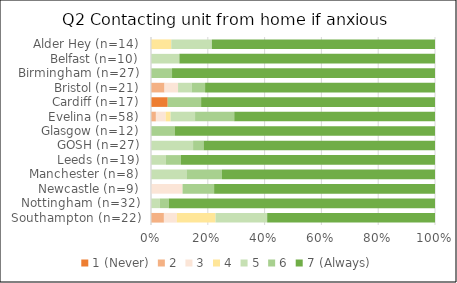
| Category | 1 (Never) | 2 | 3 | 4 | 5 | 6 | 7 (Always) |
|---|---|---|---|---|---|---|---|
| Southampton (n=22) | 0 | 1 | 1 | 3 | 4 | 0 | 13 |
| Nottingham (n=32) | 0 | 0 | 0 | 0 | 1 | 1 | 30 |
| Newcastle (n=9) | 0 | 0 | 1 | 0 | 0 | 1 | 7 |
| Manchester (n=8) | 0 | 0 | 0 | 0 | 1 | 1 | 6 |
| Leeds (n=19) | 0 | 0 | 0 | 0 | 1 | 1 | 17 |
| GOSH (n=27) | 0 | 0 | 0 | 0 | 4 | 1 | 22 |
| Glasgow (n=12) | 0 | 0 | 0 | 0 | 0 | 1 | 11 |
| Evelina (n=58) | 0 | 1 | 2 | 1 | 5 | 8 | 41 |
| Cardiff (n=17) | 1 | 0 | 0 | 0 | 0 | 2 | 14 |
| Bristol (n=21) | 0 | 1 | 1 | 0 | 1 | 1 | 17 |
| Birmingham (n=27) | 0 | 0 | 0 | 0 | 0 | 2 | 25 |
| Belfast (n=10) | 0 | 0 | 0 | 0 | 1 | 0 | 9 |
| Alder Hey (n=14) | 0 | 0 | 0 | 1 | 2 | 0 | 11 |